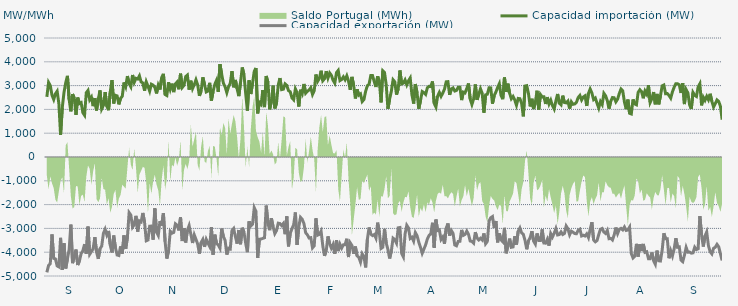
| Category | Capacidad importación (MW) | Capacidad exportación (MW) |
|---|---|---|
| 0 | 2527.5 | -4845 |
| 1900-01-01 | 3132.875 | -4556.25 |
| 1900-01-02 | 3001.875 | -4479.375 |
| 1900-01-03 | 2597 | -3253.75 |
| 1900-01-04 | 2415.833 | -4258.125 |
| 1900-01-05 | 2655 | -4284.375 |
| 1900-01-06 | 2764.458 | -4576.875 |
| 1900-01-07 | 2248.625 | -4616.25 |
| 1900-01-08 | 931.875 | -3396.042 |
| 1900-01-09 | 2074.792 | -4740 |
| 1900-01-10 | 2707.5 | -3624.375 |
| 1900-01-11 | 3118.125 | -4681.875 |
| 1900-01-12 | 3408.75 | -4280.625 |
| 1900-01-13 | 2415 | -3889.583 |
| 1900-01-14 | 1918.917 | -2840.25 |
| 1900-01-15 | 2645.125 | -4460.625 |
| 1900-01-16 | 2469.792 | -4186.875 |
| 1900-01-17 | 1772.542 | -3887.917 |
| 1900-01-18 | 2498.667 | -4538.125 |
| 1900-01-19 | 2245.542 | -4370 |
| 1900-01-20 | 2285.625 | -4056.25 |
| 1900-01-21 | 1862.708 | -3941.667 |
| 1900-01-22 | 1755.417 | -3663.125 |
| 1900-01-23 | 2699.583 | -4063.125 |
| 1900-01-24 | 2797.5 | -2925.625 |
| 1900-01-25 | 2403.333 | -4085.625 |
| 1900-01-26 | 2516.25 | -3971.25 |
| 1900-01-27 | 2135.625 | -3854.792 |
| 1900-01-28 | 2477.125 | -3369.292 |
| 1900-01-29 | 1956.292 | -3999.375 |
| 1900-01-30 | 2427.5 | -4280 |
| 1900-01-31 | 2798 | -3856.875 |
| 1900-02-01 | 2018.125 | -3744.583 |
| 1900-02-02 | 2168.958 | -3208.75 |
| 1900-02-03 | 2728.125 | -3034.375 |
| 1900-02-04 | 2131.75 | -3278.125 |
| 1900-02-05 | 1966.875 | -3106.458 |
| 1900-02-06 | 2738.083 | -3703.375 |
| 1900-02-07 | 3229.167 | -4012.5 |
| 1900-02-08 | 2249.792 | -3300.833 |
| 1900-02-09 | 2592.917 | -3809.792 |
| 1900-02-10 | 2566.25 | -4116.667 |
| 1900-02-11 | 2212.5 | -4138.708 |
| 1900-02-12 | 2464.375 | -3755.833 |
| 1900-02-13 | 2551.042 | -4061.25 |
| 1900-02-14 | 3133.5 | -3295.833 |
| 1900-02-15 | 2953.75 | -3854.167 |
| 1900-02-16 | 3401.25 | -3375.917 |
| 1900-02-17 | 3082.5 | -2336.25 |
| 1900-02-18 | 2949.375 | -2439.375 |
| 1900-02-19 | 3446.25 | -2947.5 |
| 1900-02-20 | 3138.75 | -2840.625 |
| 1900-02-21 | 3305 | -2472.958 |
| 1900-02-22 | 3276.125 | -3134.625 |
| 1900-02-23 | 3410.625 | -2685.417 |
| 1900-02-24 | 3153.75 | -2727.292 |
| 1900-02-25 | 3110.625 | -2351.25 |
| 1900-02-26 | 2786.458 | -2737.5 |
| 1900-02-27 | 3159.375 | -3519.375 |
| 1900-02-28 | 2974.6 | -3488.4 |
| 1900-02-28 | 2766.667 | -2906.917 |
| 1900-03-01 | 3058.125 | -2902.5 |
| 1900-03-02 | 3018.75 | -3474.375 |
| 1900-03-03 | 2925.625 | -2158.375 |
| 1900-03-04 | 2670.667 | -3157.5 |
| 1900-03-05 | 3015 | -3296.25 |
| 1900-03-06 | 2835.25 | -2693.125 |
| 1900-03-07 | 3337.5 | -2882.083 |
| 1900-03-08 | 3493.125 | -2358.75 |
| 1900-03-09 | 2626.042 | -3555 |
| 1900-03-10 | 2583.542 | -4267.5 |
| 1900-03-11 | 3140.625 | -3948.75 |
| 1900-03-12 | 2844.375 | -3122.5 |
| 1900-03-13 | 3082.5 | -3200.625 |
| 1900-03-14 | 2726.25 | -3170.625 |
| 1900-03-15 | 3071.25 | -2806.875 |
| 1900-03-16 | 3151.875 | -2865 |
| 1900-03-17 | 2845.417 | -3084.375 |
| 1900-03-18 | 3500.625 | -2536.875 |
| 1900-03-19 | 2921.75 | -3531.625 |
| 1900-03-20 | 3012.625 | -2985.75 |
| 1900-03-21 | 3378.75 | -3590.625 |
| 1900-03-22 | 3442.5 | -3078.75 |
| 1900-03-23 | 2829.167 | -2881.042 |
| 1900-03-24 | 3205.833 | -3234.375 |
| 1900-03-25 | 2873.625 | -3613.125 |
| 1900-03-26 | 3038.333 | -3270 |
| 1900-03-27 | 3245.625 | -3459.375 |
| 1900-03-28 | 3029.167 | -3656.25 |
| 1900-03-29 | 2571.042 | -4057.5 |
| 1900-03-30 | 2766.125 | -3596.417 |
| 1900-03-31 | 3348.75 | -3465 |
| 1900-04-01 | 3046.333 | -3774.375 |
| 1900-04-02 | 2732.708 | -3460.042 |
| 1900-04-03 | 2770.75 | -3616.875 |
| 1900-04-04 | 3116.25 | -3757.75 |
| 1900-04-05 | 2370.5 | -2949.375 |
| 1900-04-06 | 2758.625 | -4102.5 |
| 1900-04-07 | 3054.167 | -3262.5 |
| 1900-04-08 | 3221.875 | -3637.5 |
| 1900-04-09 | 2734.792 | -3695.625 |
| 1900-04-10 | 3901.875 | -3830.625 |
| 1900-04-11 | 3478.125 | -3007.5 |
| 1900-04-12 | 3100.208 | -3343.125 |
| 1900-04-13 | 2951.458 | -3500.625 |
| 1900-04-14 | 2703.125 | -4100.625 |
| 1900-04-15 | 2949.667 | -3832.5 |
| 1900-04-16 | 3092.292 | -3864.375 |
| 1900-04-17 | 3609.375 | -3088.125 |
| 1900-04-18 | 2928.75 | -3003.75 |
| 1900-04-19 | 3238.333 | -3346.875 |
| 1900-04-20 | 2865.417 | -3639.375 |
| 1900-04-21 | 2557.917 | -3067.5 |
| 1900-04-22 | 3131.667 | -3665.625 |
| 1900-04-23 | 3761.25 | -2973.625 |
| 1900-04-24 | 3468.542 | -3153.75 |
| 1900-04-25 | 2673.75 | -3622.5 |
| 1900-04-26 | 1945.625 | -3999.375 |
| 1900-04-27 | 3222.083 | -2703.875 |
| 1900-04-28 | 2645.458 | -2900.625 |
| 1900-04-29 | 3097.5 | -2827.5 |
| 1900-04-30 | 3595.208 | -2128.75 |
| 1900-05-01 | 3741.458 | -2283.75 |
| 1900-05-02 | 1833.125 | -4242.5 |
| 1900-05-03 | 2294.25 | -3457.125 |
| 1900-05-04 | 2210.833 | -3444.375 |
| 1900-05-05 | 2808.75 | -3420 |
| 1900-05-06 | 2098.083 | -3391.875 |
| 1900-05-07 | 3404.792 | -2041.875 |
| 1900-05-08 | 3136.875 | -2790.292 |
| 1900-05-09 | 2001.25 | -3075.75 |
| 1900-05-10 | 2334.583 | -2570.625 |
| 1900-05-11 | 2998.542 | -2932.5 |
| 1900-05-12 | 2041.583 | -3219.375 |
| 1900-05-13 | 2261.875 | -3091.875 |
| 1900-05-14 | 3017.292 | -2780.625 |
| 1900-05-15 | 3316.667 | -2796 |
| 1900-05-16 | 2831.875 | -2880.375 |
| 1900-05-17 | 2848.875 | -2791.375 |
| 1900-05-18 | 3072.083 | -3242.5 |
| 1900-05-19 | 3008.75 | -2494.125 |
| 1900-05-20 | 2789.75 | -3753.75 |
| 1900-05-21 | 2740.75 | -3208.125 |
| 1900-05-22 | 2484.167 | -3015 |
| 1900-05-23 | 2405.083 | -2845.208 |
| 1900-05-24 | 2862.542 | -2330.625 |
| 1900-05-25 | 2704.875 | -3693.75 |
| 1900-05-26 | 2121.458 | -2932.25 |
| 1900-05-27 | 2826.875 | -2536.458 |
| 1900-05-28 | 2666.25 | -2617.875 |
| 1900-05-29 | 3068.375 | -2797.625 |
| 1900-05-30 | 2681.458 | -3181.875 |
| 1900-05-31 | 2762.167 | -3268.125 |
| 1900-06-01 | 2816.458 | -3403.125 |
| 1900-06-02 | 2908.75 | -3388.125 |
| 1900-06-03 | 2628.458 | -3817.5 |
| 1900-06-04 | 2784.5 | -3729.375 |
| 1900-06-05 | 3466.875 | -2575.375 |
| 1900-06-06 | 3180 | -3284.375 |
| 1900-06-07 | 3301.25 | -3251.25 |
| 1900-06-08 | 3624.375 | -3114.375 |
| 1900-06-09 | 3203.333 | -3733.125 |
| 1900-06-10 | 3288.125 | -4155 |
| 1900-06-11 | 3606.25 | -3943.125 |
| 1900-06-12 | 3313.75 | -3335.625 |
| 1900-06-13 | 3531.417 | -3646.875 |
| 1900-06-14 | 3433.125 | -3826.875 |
| 1900-06-15 | 3223.542 | -3673.333 |
| 1900-06-16 | 3103.75 | -4066.875 |
| 1900-06-17 | 3546.25 | -3496.875 |
| 1900-06-18 | 3638.5 | -3952.5 |
| 1900-06-19 | 3210 | -3661.875 |
| 1900-06-20 | 3255.417 | -3826.875 |
| 1900-06-21 | 3367.5 | -3690 |
| 1900-06-22 | 3244.5 | -3684.375 |
| 1900-06-23 | 3411.458 | -3435 |
| 1900-06-24 | 3192.708 | -4203.75 |
| 1900-06-25 | 2825 | -3605.625 |
| 1900-06-26 | 3365.667 | -3718.625 |
| 1900-06-27 | 3014.375 | -4063.125 |
| 1900-06-28 | 2458.292 | -3762 |
| 1900-06-29 | 2845.5 | -4151.25 |
| 1900-06-30 | 2597.292 | -4215 |
| 1900-07-01 | 2650.375 | -4415.625 |
| 1900-07-02 | 2331.042 | -4066.875 |
| 1900-07-03 | 2415.625 | -4185 |
| 1900-07-04 | 2763.875 | -4638.75 |
| 1900-07-05 | 2996.042 | -3465 |
| 1900-07-06 | 3054.375 | -2960.625 |
| 1900-07-07 | 3421.875 | -3238.875 |
| 1900-07-08 | 3422.25 | -3301.458 |
| 1900-07-09 | 3168.75 | -3257.708 |
| 1900-07-10 | 2940.75 | -3407.5 |
| 1900-07-11 | 3391.875 | -2758.75 |
| 1900-07-12 | 3159.375 | -3175.208 |
| 1900-07-13 | 2294.792 | -3843.75 |
| 1900-07-14 | 3620.625 | -3793.125 |
| 1900-07-15 | 3550.208 | -3016.875 |
| 1900-07-16 | 3036.458 | -3616.875 |
| 1900-07-17 | 2023.333 | -3886.25 |
| 1900-07-18 | 2440.208 | -4263.75 |
| 1900-07-19 | 2764.167 | -3943.125 |
| 1900-07-20 | 3245.625 | -3410.667 |
| 1900-07-21 | 3161.25 | -3470.625 |
| 1900-07-22 | 2621.458 | -3614.625 |
| 1900-07-23 | 2861.25 | -2975.958 |
| 1900-07-24 | 3635.217 | -2962.391 |
| 1900-07-25 | 3071.083 | -4052.75 |
| 1900-07-26 | 3103.625 | -4196.25 |
| 1900-07-27 | 3238.125 | -3235.75 |
| 1900-07-28 | 3031.875 | -2868.708 |
| 1900-07-29 | 3202.5 | -2981.292 |
| 1900-07-30 | 3320.625 | -3422.292 |
| 1900-07-31 | 2615.625 | -3370.417 |
| 1900-08-01 | 2244.375 | -3535.625 |
| 1900-08-02 | 3067.5 | -3176.25 |
| 1900-08-03 | 2692.458 | -3306.875 |
| 1900-08-04 | 2025 | -3576.042 |
| 1900-08-05 | 2373.833 | -3795 |
| 1900-08-06 | 2750.458 | -4045 |
| 1900-08-07 | 2704.167 | -3868.417 |
| 1900-08-08 | 2628.75 | -3691.667 |
| 1900-08-09 | 2910 | -3448.125 |
| 1900-08-10 | 2971.875 | -3293.375 |
| 1900-08-11 | 2958.5 | -3229.167 |
| 1900-08-12 | 3174.375 | -2764.583 |
| 1900-08-13 | 2253.75 | -3813.75 |
| 1900-08-14 | 2100 | -2628.667 |
| 1900-08-15 | 2557.5 | -3088.333 |
| 1900-08-16 | 2713.125 | -3062.25 |
| 1900-08-17 | 2546.875 | -3463.625 |
| 1900-08-18 | 2686.458 | -3359.458 |
| 1900-08-19 | 2850 | -3646.042 |
| 1900-08-20 | 3159.375 | -2992.292 |
| 1900-08-21 | 3166.875 | -2793.125 |
| 1900-08-22 | 2613.75 | -3298.833 |
| 1900-08-23 | 2857.5 | -3089.625 |
| 1900-08-24 | 2903.875 | -3210.125 |
| 1900-08-25 | 2772 | -3696.792 |
| 1900-08-26 | 2797.5 | -3731.25 |
| 1900-08-27 | 2930.625 | -3545.625 |
| 1900-08-28 | 2932.5 | -3541.875 |
| 1900-08-29 | 2390.625 | -3064.167 |
| 1900-08-30 | 2726.25 | -3293.333 |
| 1900-08-31 | 2694.375 | -3252.708 |
| 1900-09-01 | 2878.125 | -3111.875 |
| 1900-09-02 | 3088.125 | -3247.5 |
| 1900-09-03 | 2435.625 | -3528.958 |
| 1900-09-04 | 2206.875 | -3547.708 |
| 1900-09-05 | 2435.625 | -3618.75 |
| 1900-09-06 | 3046.875 | -3157.917 |
| 1900-09-07 | 2400 | -3406.875 |
| 1900-09-08 | 2640 | -3488.125 |
| 1900-09-09 | 2866.875 | -3413.542 |
| 1900-09-10 | 2675.625 | -3486.458 |
| 1900-09-11 | 1861.25 | -3211.667 |
| 1900-09-12 | 2611.875 | -3644.375 |
| 1900-09-13 | 2638.125 | -3547.083 |
| 1900-09-14 | 2906.25 | -2688.333 |
| 1900-09-15 | 2904.375 | -2549.583 |
| 1900-09-16 | 2240.625 | -2502.083 |
| 1900-09-17 | 2576.25 | -2981.667 |
| 1900-09-18 | 2732.25 | -2689.375 |
| 1900-09-19 | 2919.375 | -3586.875 |
| 1900-09-20 | 3078.75 | -3206.25 |
| 1900-09-21 | 2587.5 | -3481.875 |
| 1900-09-22 | 2430 | -3560.625 |
| 1900-09-23 | 3341.25 | -2977.542 |
| 1900-09-24 | 2733.75 | -4046.25 |
| 1900-09-25 | 3080.625 | -3725.417 |
| 1900-09-26 | 2681.25 | -3429.375 |
| 1900-09-27 | 2448.75 | -3793.125 |
| 1900-09-28 | 2544.125 | -3778.125 |
| 1900-09-29 | 2394.958 | -3328.125 |
| 1900-09-30 | 2175 | -3678.75 |
| 1900-10-01 | 2461.167 | -3117.375 |
| 1900-10-02 | 2448.75 | -2981.542 |
| 1900-10-03 | 2255.042 | -3185.833 |
| 1900-10-04 | 1708.042 | -3250.208 |
| 1900-10-05 | 2981.25 | -3508.125 |
| 1900-10-06 | 2998.125 | -3877.5 |
| 1900-10-07 | 2664.375 | -3519.375 |
| 1900-10-08 | 2124.375 | -3382.5 |
| 1900-10-09 | 2446.875 | -3115.792 |
| 1900-10-10 | 2015.417 | -3534.375 |
| 1900-10-11 | 2289.375 | -3658.125 |
| 1900-10-12 | 2784.375 | -3211.083 |
| 1900-10-13 | 1993.125 | -3504.792 |
| 1900-10-14 | 2624.875 | -3506.458 |
| 1900-10-15 | 2523.75 | -3042.583 |
| 1900-10-16 | 2531.25 | -3613.125 |
| 1900-10-17 | 2229.583 | -3620.625 |
| 1900-10-18 | 2515.875 | -3455.625 |
| 1900-10-19 | 2227.5 | -3723.75 |
| 1900-10-20 | 2388.375 | -3217.458 |
| 1900-10-21 | 2157.875 | -3361.542 |
| 1900-10-22 | 2014.583 | -3202.708 |
| 1900-10-23 | 2357.917 | -3006.583 |
| 1900-10-24 | 2647.75 | -3275.625 |
| 1900-10-25 | 2259.375 | -3258.75 |
| 1900-10-26 | 2191.875 | -3148.125 |
| 1900-10-27 | 2578.125 | -3256.875 |
| 1900-10-28 | 2289.375 | -3211.875 |
| 1900-10-29 | 2272.917 | -2898.25 |
| 1900-10-30 | 2349.75 | -3012.25 |
| 1900-10-31 | 2034.167 | -3270 |
| 1900-11-01 | 2319.375 | -3116.25 |
| 1900-11-02 | 2214.375 | -3159.375 |
| 1900-11-03 | 2229.167 | -3217.5 |
| 1900-11-04 | 2296.875 | -3223.125 |
| 1900-11-05 | 2497.5 | -3080.208 |
| 1900-11-06 | 2585.5 | -3034.292 |
| 1900-11-07 | 2394.375 | -3318.75 |
| 1900-11-08 | 2520 | -3286.875 |
| 1900-11-09 | 2570.625 | -3320.625 |
| 1900-11-10 | 2145 | -3229.583 |
| 1900-11-11 | 2673.75 | -3384.375 |
| 1900-11-12 | 2855.625 | -3040.333 |
| 1900-11-13 | 2689.875 | -2741.708 |
| 1900-11-14 | 2413.125 | -3485.625 |
| 1900-11-15 | 2476.875 | -3564.375 |
| 1900-11-16 | 2258.75 | -3510 |
| 1900-11-17 | 2056.875 | -3258.75 |
| 1900-11-18 | 2326.875 | -3036.667 |
| 1900-11-19 | 2203.125 | -3003.75 |
| 1900-11-20 | 2675.333 | -3153.417 |
| 1900-11-21 | 2572.5 | -3211.875 |
| 1900-11-22 | 2368.125 | -3082.917 |
| 1900-11-23 | 2032.5 | -3433.125 |
| 1900-11-24 | 2340 | -3418.125 |
| 1900-11-25 | 2499.375 | -3485.625 |
| 1900-11-26 | 2488.125 | -3277.5 |
| 1900-11-27 | 2317.5 | -2963.167 |
| 1900-11-28 | 2431.875 | -3217.5 |
| 1900-11-29 | 2668.125 | -3039.375 |
| 1900-11-30 | 2855.625 | -2998.125 |
| 1900-12-01 | 2778.75 | -3061.667 |
| 1900-12-02 | 2311.875 | -2941.042 |
| 1900-12-03 | 2010 | -3084.375 |
| 1900-12-04 | 2411.25 | -3065.625 |
| 1900-12-05 | 1837.917 | -2945.625 |
| 1900-12-06 | 1809.167 | -4055.625 |
| 1900-12-07 | 2419.792 | -4241.25 |
| 1900-12-08 | 2227.5 | -4173.75 |
| 1900-12-09 | 2191.875 | -3648.75 |
| 1900-12-10 | 2715 | -4183.125 |
| 1900-12-11 | 2826.625 | -3667.292 |
| 1900-12-12 | 2745 | -3950.625 |
| 1900-12-13 | 2467.5 | -3652.625 |
| 1900-12-14 | 2771.25 | -4006.875 |
| 1900-12-15 | 2640 | -3980.625 |
| 1900-12-16 | 3016.875 | -4271.25 |
| 1900-12-17 | 2292.292 | -4271.25 |
| 1900-12-18 | 2448.75 | -4010.625 |
| 1900-12-19 | 2730 | -4357.5 |
| 1900-12-20 | 2214.75 | -4501.875 |
| 1900-12-21 | 2650.208 | -3931.667 |
| 1900-12-22 | 2212.5 | -4361.25 |
| 1900-12-23 | 2565 | -4370.625 |
| 1900-12-24 | 2988.75 | -3920.625 |
| 1900-12-25 | 3024.375 | -3204.083 |
| 1900-12-26 | 2656.875 | -3437.708 |
| 1900-12-27 | 2664.375 | -3437.5 |
| 1900-12-28 | 2587.5 | -4254.375 |
| 1900-12-29 | 2473.125 | -3939.583 |
| 1900-12-30 | 2737.5 | -4156.875 |
| 1900-12-31 | 2932.5 | -3862.5 |
| 1901-01-01 | 3080.625 | -3412.708 |
| 1901-01-02 | 3078.125 | -3793.125 |
| 1901-01-03 | 3031.25 | -3776.25 |
| 1901-01-04 | 2689.875 | -4331.25 |
| 1901-01-05 | 3104.042 | -4396.875 |
| 1901-01-06 | 2223.25 | -4126.875 |
| 1901-01-07 | 2830.208 | -3799.583 |
| 1901-01-08 | 2694.375 | -3999.792 |
| 1901-01-09 | 2193.542 | -3994.167 |
| 1901-01-10 | 2019.375 | -4039.792 |
| 1901-01-11 | 2710.792 | -4026.667 |
| 1901-01-12 | 2589.292 | -3790.625 |
| 1901-01-13 | 2542.5 | -3888.75 |
| 1901-01-14 | 2943.75 | -3856.875 |
| 1901-01-15 | 3076.875 | -2486 |
| 1901-01-16 | 2169.583 | -3271.875 |
| 1901-01-17 | 2510.875 | -3762.292 |
| 1901-01-18 | 2379.375 | -3315.625 |
| 1901-01-19 | 2548.125 | -3149.875 |
| 1901-01-20 | 2405.625 | -3725.625 |
| 1901-01-21 | 2655.792 | -3978.75 |
| 1901-01-22 | 2338.917 | -4070.625 |
| 1901-01-23 | 2100.75 | -3836.25 |
| 1901-01-24 | 2239.583 | -3791.25 |
| 1901-01-25 | 2398.417 | -3671.25 |
| 1901-01-26 | 2333.375 | -3772.5 |
| 1901-01-27 | 2128.125 | -4065 |
| 1901-01-28 | 1568.375 | -4348.125 |